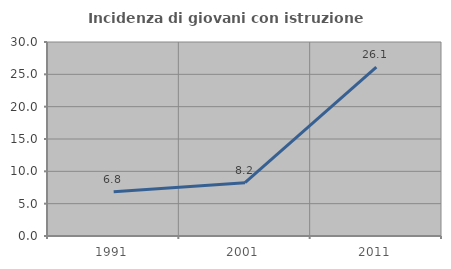
| Category | Incidenza di giovani con istruzione universitaria |
|---|---|
| 1991.0 | 6.828 |
| 2001.0 | 8.238 |
| 2011.0 | 26.134 |